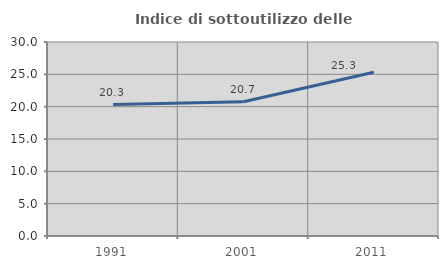
| Category | Indice di sottoutilizzo delle abitazioni  |
|---|---|
| 1991.0 | 20.328 |
| 2001.0 | 20.749 |
| 2011.0 | 25.335 |